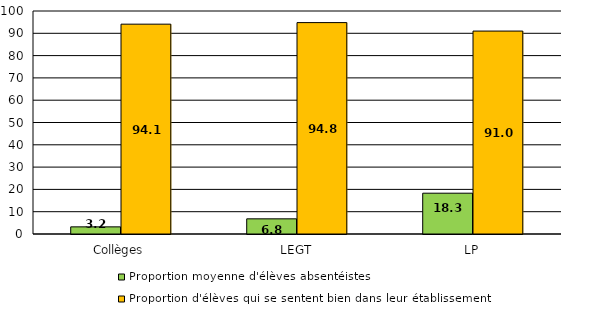
| Category | Proportion moyenne d'élèves absentéistes | Proportion d'élèves qui se sentent bien dans leur établissement |
|---|---|---|
| Collèges | 3.2 | 94.1 |
| LEGT | 6.8 | 94.8 |
| LP | 18.3 | 91 |